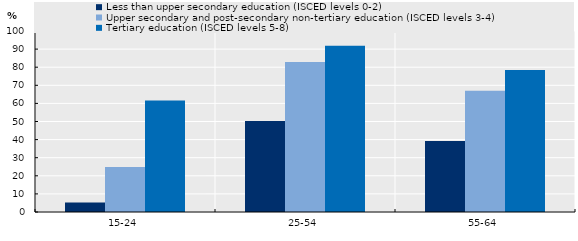
| Category | Less than upper secondary education (ISCED levels 0-2) | Upper secondary and post-secondary non-tertiary education (ISCED levels 3-4) | Tertiary education (ISCED levels 5-8) |
|---|---|---|---|
| 15-24 | 5.2 | 24.9 | 61.6 |
| 25-54 | 50.3 | 82.9 | 91.8 |
| 55-64 | 39.2 | 67 | 78.5 |